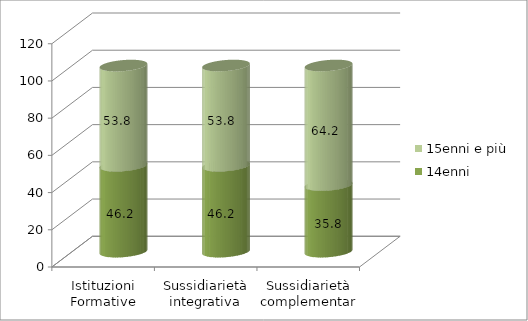
| Category | 14enni | 15enni e più |
|---|---|---|
| Istituzioni Formative | 46.2 | 53.802 |
| Sussidiarietà integrativa | 46.2 | 53.83 |
| Sussidiarietà complementare | 35.8 | 64.241 |